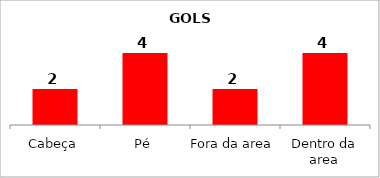
| Category | Series 1 |
|---|---|
| Cabeça | 2 |
| Pé | 4 |
| Fora da area | 2 |
| Dentro da area | 4 |